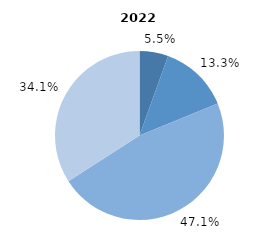
| Category | Series 0 |
|---|---|
| 0 | 5.5 |
| 1 | 13.3 |
| 2 | 47.1 |
| 3 | 34.1 |